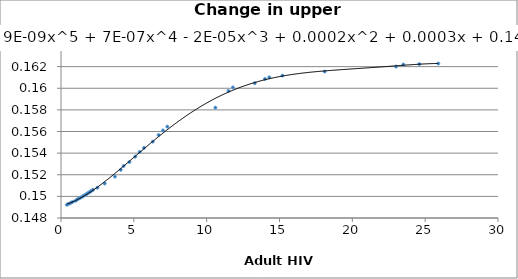
| Category | Series 0 |
|---|---|
| 0.4 | 0.149 |
| 0.5 | 0.149 |
| 0.6 | 0.149 |
| 0.7 | 0.149 |
| 0.8 | 0.149 |
| 1.0 | 0.15 |
| 1.1 | 0.15 |
| 1.2 | 0.15 |
| 1.3 | 0.15 |
| 1.4 | 0.15 |
| 1.5 | 0.15 |
| 1.6 | 0.15 |
| 1.7 | 0.15 |
| 1.8 | 0.15 |
| 1.9 | 0.15 |
| 2.0 | 0.15 |
| 2.1 | 0.151 |
| 2.2 | 0.151 |
| 2.5 | 0.151 |
| 3.0 | 0.151 |
| 3.7 | 0.152 |
| 4.1 | 0.152 |
| 4.3 | 0.153 |
| 4.7 | 0.153 |
| 5.1 | 0.154 |
| 5.4 | 0.154 |
| 5.7 | 0.154 |
| 6.3 | 0.155 |
| 6.7 | 0.156 |
| 7.0 | 0.156 |
| 7.3 | 0.156 |
| 10.6 | 0.158 |
| 11.5 | 0.16 |
| 11.8 | 0.16 |
| 13.3 | 0.16 |
| 14.0 | 0.161 |
| 14.3 | 0.161 |
| 15.2 | 0.161 |
| 18.1 | 0.162 |
| 23.0 | 0.162 |
| 23.5 | 0.162 |
| 24.6 | 0.162 |
| 25.9 | 0.162 |